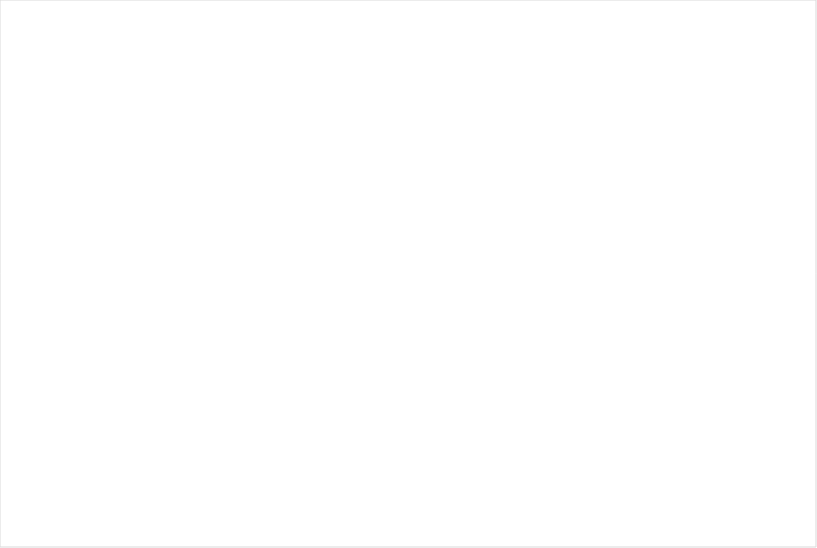
| Category | eb betaald: geen korting op basis van D&T | eb betaald: korting op basis van D&T | Geen eb betaald: ambtshalve toevoeging | Geen eb betaald: nihilstelling |
|---|---|---|---|---|
| 2007 | 203816 | 0 | 102597 | 76479 |
| 2008 | 213553 | 0 | 105792 | 82367 |
| 2009 | 239887 | 0 | 101110 | 73938 |
| 2010 | 260563 | 0 | 98544 | 53649 |
| 2011 | 247375 | 0 | 99322 | 51658 |
| 2012 | 126914 | 159064 | 94906 | 49730 |
| 2013 | 101988 | 198402 | 85020 | 47335 |
| 2014 | 79168 | 202487 | 81707 | 57471 |
| 2015 | 67574 | 201860 | 79170 | 61353 |
| 2016 | 59853 | 206358 | 78359 | 74872 |
| 2017 | 50891 | 200017 | 78954 | 59932 |
| 2018 | 47027 | 191394 | 78700 | 64476 |
| 2019 | 43184 | 183239 | 82017 | 68219 |
| 2020 | 13310 | 197724 | 80948 | 60342 |
| 2021 | 1421 | 187938 | 78004 | 60675 |
| 2022 | 1213 | 188990 | 82450 | 75368 |